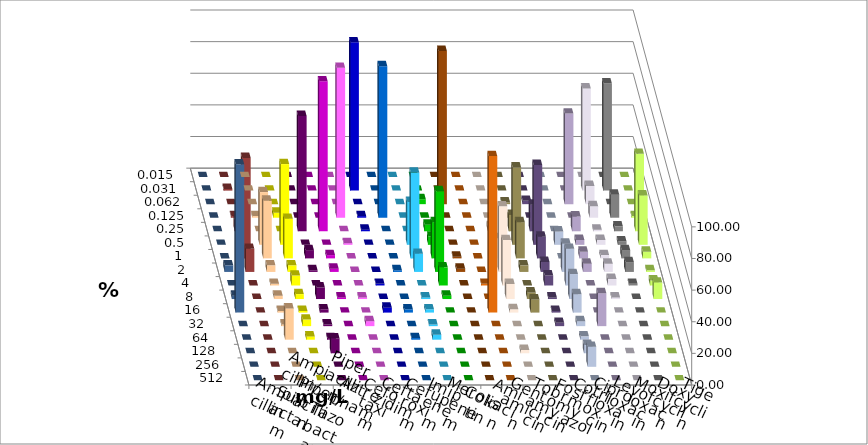
| Category | Ampicillin | Ampicillin/ Sulbactam | Piperacillin | Piperacillin/ Tazobactam | Aztreonam | Cefotaxim | Ceftazidim | Cefuroxim | Imipenem | Meropenem | Colistin | Amikacin | Gentamicin | Tobramycin | Fosfomycin | Cotrimoxazol | Ciprofloxacin | Levofloxacin | Moxifloxacin | Doxycyclin | Tigecyclin |
|---|---|---|---|---|---|---|---|---|---|---|---|---|---|---|---|---|---|---|---|---|---|
| 0.015 | 0 | 0 | 0 | 0 | 0 | 0 | 0 | 0 | 0 | 0 | 0 | 0 | 0 | 0 | 0 | 0 | 0 | 0 | 0 | 0 | 0 |
| 0.031 | 0 | 0 | 0 | 0 | 0 | 93.75 | 0 | 0 | 0 | 0 | 0 | 0 | 0 | 0 | 0 | 0 | 64.583 | 67.708 | 0 | 0 | 1.042 |
| 0.062 | 0 | 0 | 0 | 0 | 0 | 0 | 0 | 0 | 3.125 | 96.875 | 0 | 0 | 1.042 | 2.105 | 0 | 57.292 | 11.458 | 0 | 0 | 0 | 0 |
| 0.125 | 1.042 | 3.125 | 0 | 0 | 94.792 | 1.042 | 95.833 | 0 | 0 | 0 | 0 | 0 | 0 | 0 | 0 | 0 | 7.292 | 14.583 | 1.042 | 0 | 1.042 |
| 0.25 | 0 | 0 | 72.917 | 94.792 | 0 | 1.042 | 0 | 0 | 4.167 | 0 | 0 | 3.191 | 10.417 | 16.842 | 0 | 9.375 | 1.042 | 3.125 | 48.958 | 0 | 7.292 |
| 0.5 | 33.333 | 51.042 | 0 | 0 | 1.042 | 0 | 0 | 27.083 | 5.208 | 0 | 0 | 0 | 48.958 | 50.526 | 8.421 | 3.125 | 3.125 | 2.083 | 31.25 | 0 | 12.5 |
| 1.0 | 36.458 | 25 | 5.208 | 2.083 | 0 | 0 | 0 | 54.167 | 22.917 | 1.042 | 0 | 12.766 | 22.917 | 13.684 | 0 | 4.167 | 2.083 | 5.208 | 4.167 | 0 | 63.542 |
| 2.0 | 4.167 | 4.167 | 1.042 | 2.083 | 0 | 0 | 1.042 | 11.458 | 51.042 | 2.083 | 0 | 41.489 | 4.167 | 6.316 | 17.895 | 5.208 | 5.208 | 6.25 | 1.042 | 4.167 | 14.583 |
| 4.0 | 1.042 | 6.25 | 0 | 0 | 0 | 1.042 | 0 | 0 | 11.458 | 0 | 1.042 | 28.723 | 0 | 6.316 | 23.158 | 0 | 4.167 | 1.042 | 3.125 | 0 | 0 |
| 8.0 | 2.083 | 3.125 | 7.292 | 1.042 | 1.042 | 0 | 0 | 1.042 | 2.083 | 0 | 0 | 9.574 | 4.167 | 1.053 | 15.789 | 0 | 1.042 | 0 | 10.417 | 2.083 | 0 |
| 16.0 | 1.042 | 1.042 | 2.083 | 0 | 0 | 3.125 | 2.083 | 2.083 | 0 | 0 | 98.958 | 2.128 | 8.333 | 1.053 | 11.579 | 0 | 0 | 0 | 0 | 93.75 | 0 |
| 32.0 | 1.042 | 4.167 | 1.042 | 0 | 3.125 | 0 | 0 | 1.042 | 0 | 0 | 0 | 0 | 0 | 2.105 | 3.158 | 20.833 | 0 | 0 | 0 | 0 | 0 |
| 64.0 | 19.792 | 2.083 | 1.042 | 0 | 0 | 0 | 1.042 | 3.125 | 0 | 0 | 0 | 0 | 0 | 0 | 2.105 | 0 | 0 | 0 | 0 | 0 | 0 |
| 128.0 | 0 | 0 | 9.375 | 0 | 0 | 0 | 0 | 0 | 0 | 0 | 0 | 2.128 | 0 | 0 | 5.263 | 0 | 0 | 0 | 0 | 0 | 0 |
| 256.0 | 0 | 0 | 0 | 0 | 0 | 0 | 0 | 0 | 0 | 0 | 0 | 0 | 0 | 0 | 12.632 | 0 | 0 | 0 | 0 | 0 | 0 |
| 512.0 | 0 | 0 | 0 | 0 | 0 | 0 | 0 | 0 | 0 | 0 | 0 | 0 | 0 | 0 | 0 | 0 | 0 | 0 | 0 | 0 | 0 |